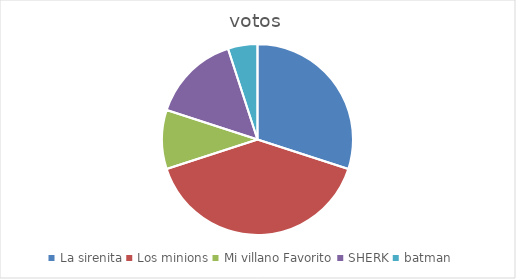
| Category | votos |
|---|---|
| La sirenita | 0.3 |
| Los minions | 0.4 |
| Mi villano Favorito | 0.1 |
| SHERK | 0.15 |
| batman | 0.05 |